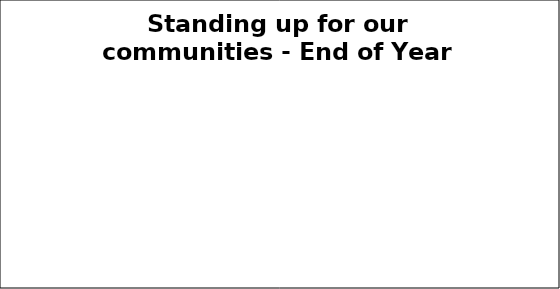
| Category | Q4 |
|---|---|
| Green | 0 |
| Amber | 0 |
| Red | 0 |